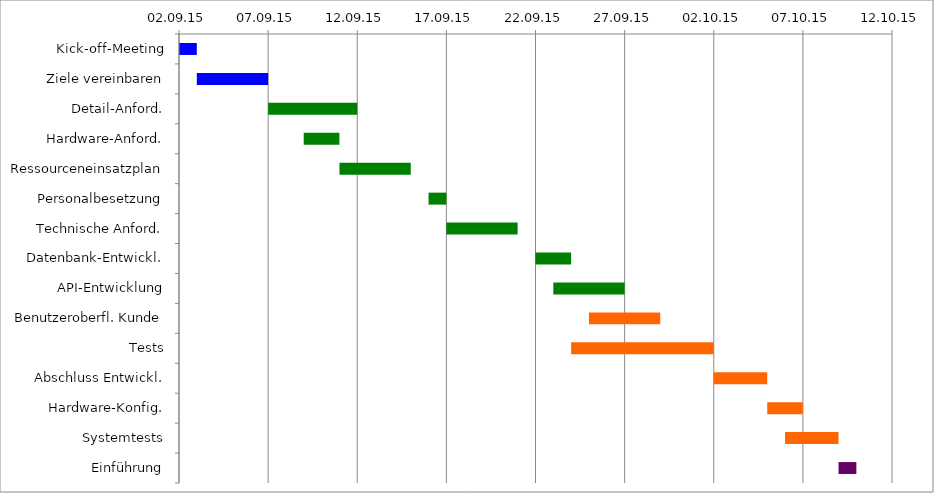
| Category | Start | Tage |
|---|---|---|
| Kick-off-Meeting | 2015-09-02 | 1 |
| Ziele vereinbaren | 2015-09-03 | 4 |
| Detail-Anford. | 2015-09-07 | 5 |
| Hardware-Anford. | 2015-09-09 | 2 |
| Ressourceneinsatzplan | 2015-09-11 | 4 |
| Personalbesetzung | 2015-09-16 | 1 |
| Technische Anford. | 2015-09-17 | 4 |
| Datenbank-Entwickl. | 2015-09-22 | 2 |
| API-Entwicklung | 2015-09-23 | 4 |
| Benutzeroberfl. Kunde | 2015-09-25 | 4 |
| Tests | 2015-09-24 | 8 |
| Abschluss Entwickl. | 2015-10-02 | 3 |
| Hardware-Konfig. | 2015-10-05 | 2 |
| Systemtests | 2015-10-06 | 3 |
| Einführung | 2015-10-09 | 1 |